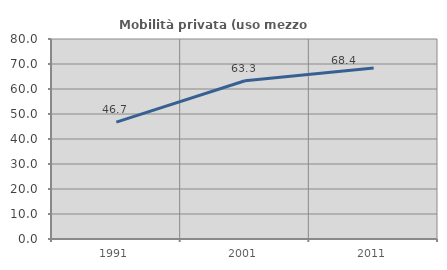
| Category | Mobilità privata (uso mezzo privato) |
|---|---|
| 1991.0 | 46.731 |
| 2001.0 | 63.286 |
| 2011.0 | 68.443 |